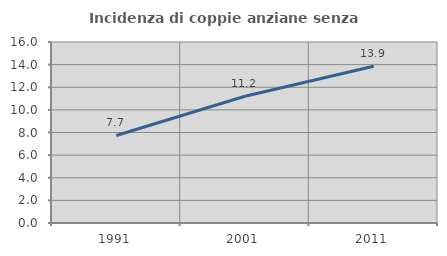
| Category | Incidenza di coppie anziane senza figli  |
|---|---|
| 1991.0 | 7.74 |
| 2001.0 | 11.203 |
| 2011.0 | 13.855 |